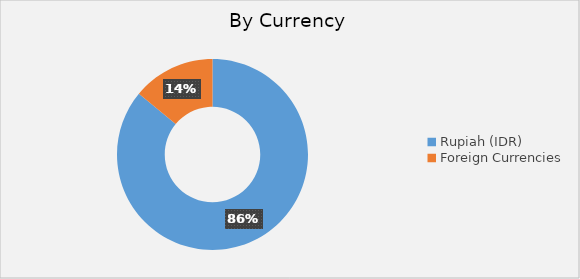
| Category | G. Currency  |
|---|---|
| Rupiah (IDR)  | 5754.54 |
| Foreign Currencies  | 936.964 |